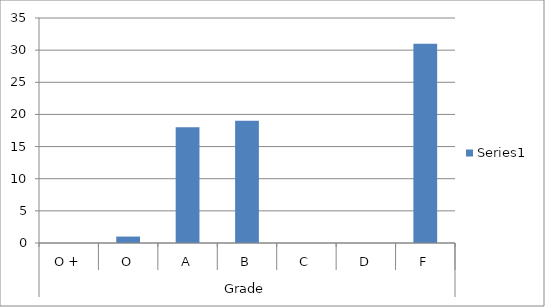
| Category | Series 0 |
|---|---|
| 0 | 0 |
| 1 | 1 |
| 2 | 18 |
| 3 | 19 |
| 4 | 0 |
| 5 | 0 |
| 6 | 31 |